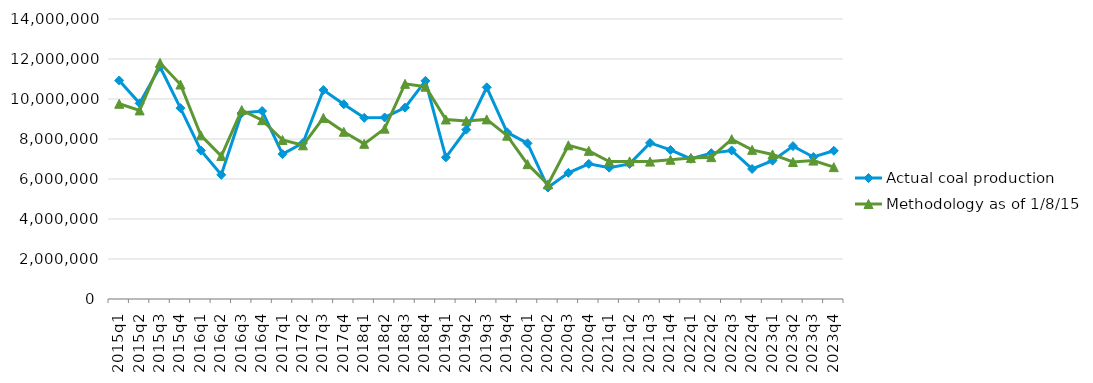
| Category | Actual coal production | Methodology as of 1/8/15 |
|---|---|---|
| 2015q1 | 10926211 | 9760606 |
| 2015q2 | 9783576 | 9430113 |
| 2015q3 | 11610306 | 11808917 |
| 2015q4 | 9543911 | 10723644 |
| 2016q1 | 7428828 | 8181831 |
| 2016q2 | 6209672 | 7146291 |
| 2016q3 | 9299465 | 9448194 |
| 2016q4 | 9397691 | 8941708 |
| 2017q1 | 7242619 | 7951816 |
| 2017q2 | 7800154 | 7684259 |
| 2017q3 | 10449765 | 9055769 |
| 2017q4 | 9739305 | 8361578 |
| 2018q1 | 9058666 | 7758012 |
| 2018q2 | 9077102 | 8517468 |
| 2018q3 | 9568015 | 10757051 |
| 2018q4 | 10906357 | 10616320 |
| 2019q1 | 7082326 | 8975187 |
| 2019q2 | 8467133 | 8904692 |
| 2019q3 | 10583648 | 8980597 |
| 2019q4 | 8334427 | 8165911 |
| 2020q1 | 7784491 | 6741390 |
| 2020q2 | 5573127 | 5728252 |
| 2020q3 | 6306422 | 7683830 |
| 2020q4 | 6757513 | 7407127 |
| 2021q1 | 6566204 | 6875050 |
| 2021q2 | 6755886 | 6880111 |
| 2021q3 | 7803632 | 6869603 |
| 2021q4 | 7453870 | 6962141 |
| 2022q1 | 7010509 | 7053745 |
| 2022q2 | 7293512 | 7092356 |
| 2022q3 | 7426566 | 7990902 |
| 2022q4 | 6502767 | 7456507 |
| 2023q1 | 6916342 | 7227404 |
| 2023q2 | 7643238 | 6848479 |
| 2023q3 | 7101541 | 6920239 |
| 2023q4 | 7410682 | 6592990 |